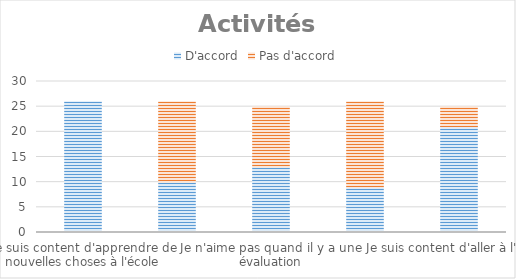
| Category | D'accord | Pas d'accord |
|---|---|---|
| Je suis content d'apprendre de nouvelles choses à l'école | 26 | 0 |
| J'ai trop de devoirs à faire à la maison | 10 | 16 |
| Je n'aime pas quand il y a une évaluation | 13 | 12 |
| Je travaille trop à l'école | 9 | 17 |
| Je suis content d'aller à l'école | 21 | 4 |